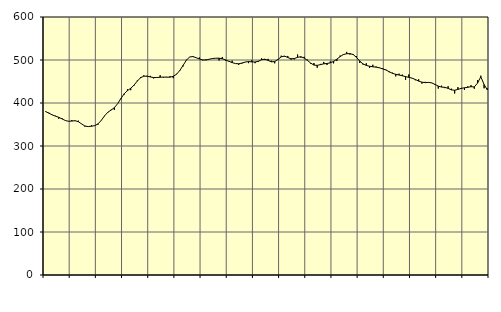
| Category | Piggar | Series 1 |
|---|---|---|
| nan | 381.1 | 380.06 |
| 87.0 | 377.4 | 376.34 |
| 87.0 | 371.9 | 372.47 |
| 87.0 | 370.3 | 369.42 |
| nan | 363.4 | 366.69 |
| 88.0 | 364.9 | 363.06 |
| 88.0 | 359.2 | 359.36 |
| 88.0 | 357 | 357.47 |
| nan | 360.5 | 358.01 |
| 89.0 | 358.1 | 358.78 |
| 89.0 | 358.9 | 356.53 |
| 89.0 | 351.1 | 351.32 |
| nan | 345 | 346.56 |
| 90.0 | 345.1 | 345.12 |
| 90.0 | 348.2 | 345.97 |
| 90.0 | 346.9 | 347.38 |
| nan | 349.5 | 351.33 |
| 91.0 | 359 | 359.55 |
| 91.0 | 369.3 | 370.07 |
| 91.0 | 377.6 | 378.51 |
| nan | 384.3 | 383.52 |
| 92.0 | 383.8 | 389.17 |
| 92.0 | 398.3 | 398.34 |
| 92.0 | 411.5 | 410.36 |
| nan | 419.5 | 421.38 |
| 93.0 | 432 | 428.66 |
| 93.0 | 429.8 | 434.32 |
| 93.0 | 440 | 441.44 |
| nan | 452.1 | 450.78 |
| 94.0 | 460.4 | 458.74 |
| 94.0 | 464.4 | 462.29 |
| 94.0 | 463.3 | 462.26 |
| nan | 463.1 | 460.53 |
| 95.0 | 457.1 | 459.21 |
| 95.0 | 459 | 459.27 |
| 95.0 | 464.6 | 459.88 |
| nan | 459 | 460.31 |
| 96.0 | 460.8 | 460.04 |
| 96.0 | 462.3 | 460.07 |
| 96.0 | 457.6 | 462.13 |
| nan | 467.7 | 466.79 |
| 97.0 | 474.5 | 475.64 |
| 97.0 | 485 | 487.38 |
| 97.0 | 500.5 | 499.43 |
| nan | 507.3 | 507.02 |
| 98.0 | 509.3 | 507.89 |
| 98.0 | 505.3 | 505.36 |
| 98.0 | 505.8 | 502.39 |
| nan | 499.4 | 500.19 |
| 99.0 | 501.1 | 499.91 |
| 99.0 | 502 | 501.82 |
| 99.0 | 503.9 | 503.51 |
| nan | 504.2 | 504.11 |
| 0.0 | 499 | 504.19 |
| 0.0 | 507 | 502.93 |
| 0.0 | 498.4 | 500.08 |
| nan | 496.1 | 496.9 |
| 1.0 | 498.4 | 494.04 |
| 1.0 | 491.6 | 491.75 |
| 1.0 | 488.6 | 491.24 |
| nan | 491.6 | 492.91 |
| 2.0 | 495 | 495.24 |
| 2.0 | 492.7 | 496.29 |
| 2.0 | 499.4 | 495.61 |
| nan | 492.6 | 495.36 |
| 3.0 | 495.4 | 497.07 |
| 3.0 | 503.8 | 500.61 |
| 3.0 | 500 | 501.97 |
| nan | 502.6 | 499.05 |
| 4.0 | 498.2 | 495.76 |
| 4.0 | 492.3 | 496.23 |
| 4.0 | 501.9 | 501.27 |
| nan | 510 | 507.34 |
| 5.0 | 508 | 509.1 |
| 5.0 | 509.4 | 505.85 |
| 5.0 | 500.8 | 502.8 |
| nan | 501.4 | 503.41 |
| 6.0 | 512.7 | 506.28 |
| 6.0 | 505.4 | 507.62 |
| 6.0 | 507.4 | 504.55 |
| nan | 500.9 | 499.07 |
| 7.0 | 491.2 | 492.77 |
| 7.0 | 493 | 488.18 |
| 7.0 | 482 | 487.55 |
| nan | 490.9 | 489.29 |
| 8.0 | 495.5 | 491.08 |
| 8.0 | 488.5 | 491.91 |
| 8.0 | 496.6 | 493.35 |
| nan | 492.2 | 496.77 |
| 9.0 | 497.6 | 501.93 |
| 9.0 | 510.3 | 507.87 |
| 9.0 | 513.9 | 512.62 |
| nan | 518.8 | 514.52 |
| 10.0 | 512.6 | 514.85 |
| 10.0 | 513.9 | 512.65 |
| 10.0 | 509.1 | 506.07 |
| nan | 493.2 | 497.4 |
| 11.0 | 489.3 | 490.88 |
| 11.0 | 492.4 | 487.34 |
| 11.0 | 481.6 | 485.48 |
| nan | 488.9 | 484.2 |
| 12.0 | 484.8 | 483.37 |
| 12.0 | 481.3 | 481.91 |
| 12.0 | 480.8 | 479.27 |
| nan | 477.5 | 476.73 |
| 13.0 | 471.5 | 472.84 |
| 13.0 | 470.5 | 468.88 |
| 13.0 | 461.9 | 466.77 |
| nan | 468.2 | 465.11 |
| 14.0 | 466.1 | 463.32 |
| 14.0 | 453.9 | 461.35 |
| 14.0 | 466.4 | 459.63 |
| nan | 458 | 457.83 |
| 15.0 | 452.9 | 454.59 |
| 15.0 | 455.1 | 450.98 |
| 15.0 | 445.1 | 448.41 |
| nan | 449.2 | 447.39 |
| 16.0 | 447.3 | 447.92 |
| 16.0 | 446.3 | 446.77 |
| 16.0 | 441.9 | 443.16 |
| nan | 433.6 | 439.28 |
| 17.0 | 440.2 | 437.04 |
| 17.0 | 434.6 | 436.35 |
| 17.0 | 439 | 434.07 |
| nan | 433.3 | 430.54 |
| 18.0 | 422.1 | 429.6 |
| 18.0 | 436.9 | 431.59 |
| 18.0 | 432.8 | 434.03 |
| nan | 430.2 | 435.39 |
| 19.0 | 438.7 | 436.46 |
| 19.0 | 441.4 | 437.94 |
| 19.0 | 433.2 | 437.28 |
| nan | 453.1 | 446.31 |
| 20.0 | 463.5 | 461.02 |
| 20.0 | 434.2 | 442.86 |
| 20.0 | 433.9 | 430.44 |